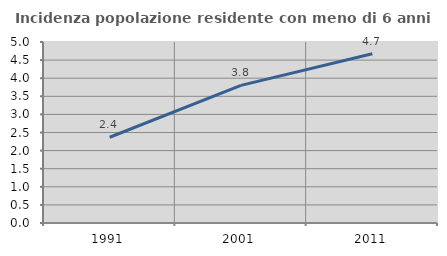
| Category | Incidenza popolazione residente con meno di 6 anni |
|---|---|
| 1991.0 | 2.369 |
| 2001.0 | 3.802 |
| 2011.0 | 4.675 |